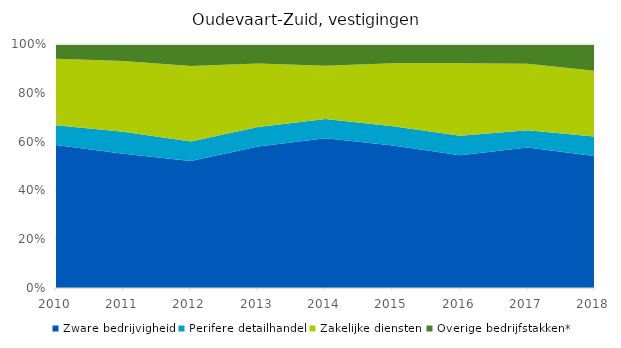
| Category | Zware bedrijvigheid | Perifere detailhandel | Zakelijke diensten | Overige bedrijfstakken* |
|---|---|---|---|---|
| 2010 | 0.58 | 0.08 | 0.27 | 0.06 |
| 2011 | 0.55 | 0.09 | 0.29 | 0.07 |
| 2012 | 0.52 | 0.08 | 0.31 | 0.09 |
| 2013 | 0.58 | 0.08 | 0.26 | 0.08 |
| 2014 | 0.62 | 0.08 | 0.22 | 0.09 |
| 2015 | 0.59 | 0.08 | 0.26 | 0.08 |
| 2016 | 0.55 | 0.08 | 0.3 | 0.08 |
| 2017 | 0.57 | 0.07 | 0.27 | 0.08 |
| 2018 | 0.54 | 0.08 | 0.27 | 0.11 |